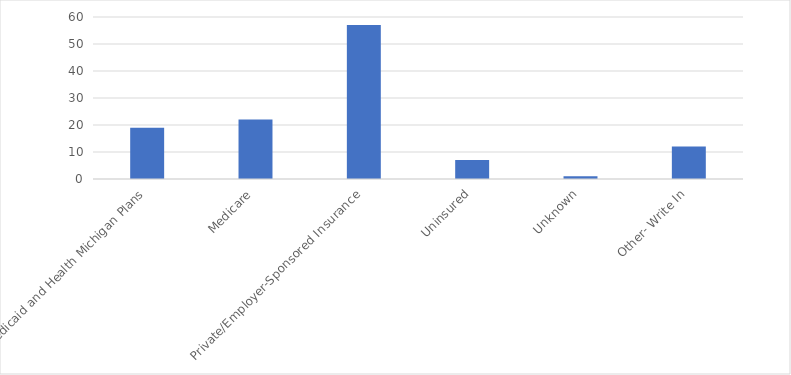
| Category | Number of Responses |
|---|---|
| Medicaid and Health Michigan Plans | 19 |
| Medicare | 22 |
| Private/Employer-Sponsored Insurance | 57 |
| Uninsured | 7 |
| Unknown | 1 |
| Other- Write In | 12 |